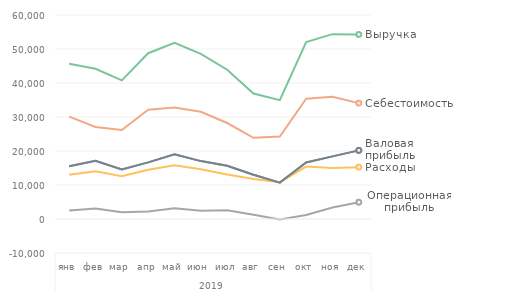
| Category | Выручка | Себестоимость | Валовая прибыль | Расходы | Операционная прибыль | факт |
|---|---|---|---|---|---|---|
| 0 | 45648 | 30119.04 | 15528.96 | 12999.317 | 2529.643 | 15528.96 |
| 1 | 44186.855 | 27044.598 | 17142.256 | 14075.185 | 3067.071 | 17142.256 |
| 2 | 40759.089 | 26183.895 | 14575.194 | 12600.41 | 1974.783 | 14575.194 |
| 3 | 48763.035 | 32110.434 | 16652.602 | 14465.153 | 2187.449 | 16652.602 |
| 4 | 51809.222 | 32796.38 | 19012.842 | 15837.348 | 3175.494 | 19012.842 |
| 5 | 48582.262 | 31552.791 | 17029.472 | 14608.625 | 2420.847 | 17029.472 |
| 6 | 43906.499 | 28232.33 | 15674.169 | 13078.539 | 2595.63 | 15674.169 |
| 7 | 36890.502 | 23885.519 | 13004.982 | 11752.923 | 1252.059 | 13004.982 |
| 8 | 34954.295 | 24263.121 | 10691.174 | 10842.43 | -151.256 | 10691.174 |
| 9 | 52032.283 | 35399.587 | 16632.696 | 15430.74 | 1201.957 | 16632.696 |
| 10 | 54370.824 | 35952.317 | 18418.507 | 15027.982 | 3390.526 | 18418.507 |
| 11 | 54272.217 | 34082.207 | 20190.009 | 15256.721 | 4933.289 | 20190.009 |